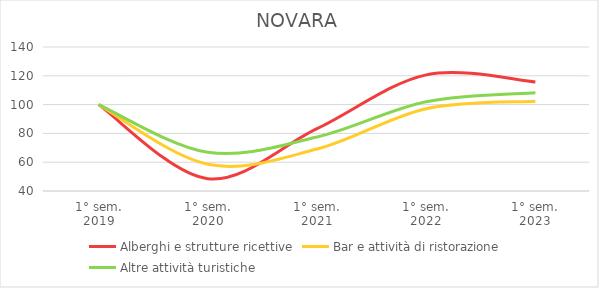
| Category | Alberghi e strutture ricettive | Bar e attività di ristorazione | Altre attività turistiche |
|---|---|---|---|
| 1° sem.
2019 | 100 | 100 | 100 |
| 1° sem.
2020 | 48.562 | 58.566 | 66.872 |
| 1° sem.
2021 | 83.249 | 69.137 | 77.463 |
| 1° sem.
2022 | 120.643 | 97.175 | 101.97 |
| 1° sem.
2023 | 115.736 | 102.369 | 108.251 |